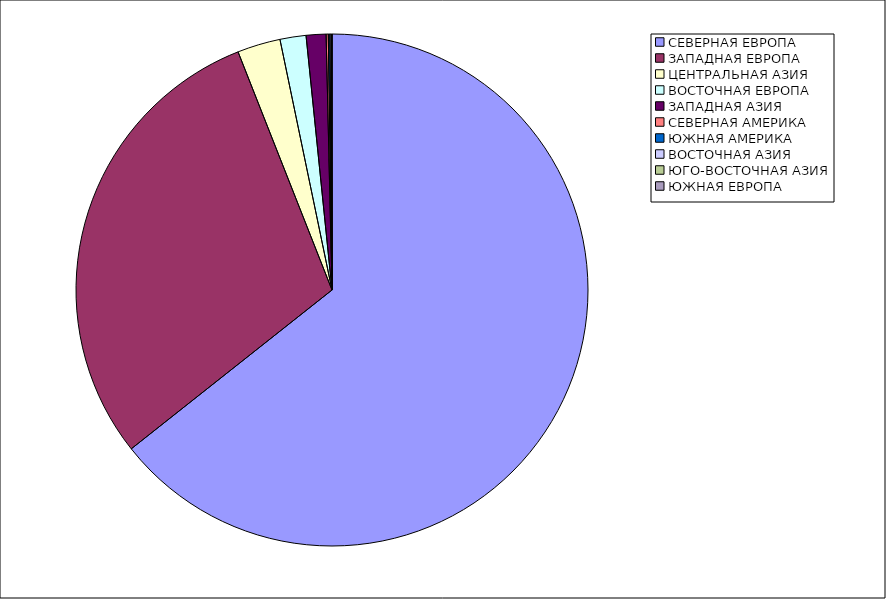
| Category | Оборот |
|---|---|
| СЕВЕРНАЯ ЕВРОПА | 64.346 |
| ЗАПАДНАЯ ЕВРОПА | 29.674 |
| ЦЕНТРАЛЬНАЯ АЗИЯ | 2.72 |
| ВОСТОЧНАЯ ЕВРОПА | 1.641 |
| ЗАПАДНАЯ АЗИЯ | 1.252 |
| СЕВЕРНАЯ АМЕРИКА | 0.135 |
| ЮЖНАЯ АМЕРИКА | 0.1 |
| ВОСТОЧНАЯ АЗИЯ | 0.079 |
| ЮГО-ВОСТОЧНАЯ АЗИЯ | 0.049 |
| ЮЖНАЯ ЕВРОПА | 0.003 |